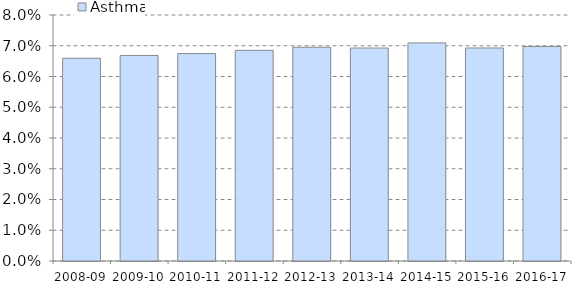
| Category | Asthma |
|---|---|
| 2008-09 | 0.066 |
| 2009-10 | 0.067 |
| 2010-11 | 0.067 |
| 2011-12 | 0.069 |
| 2012-13 | 0.07 |
| 2013-14 | 0.069 |
| 2014-15 | 0.071 |
| 2015-16 | 0.069 |
| 2016-17 | 0.07 |